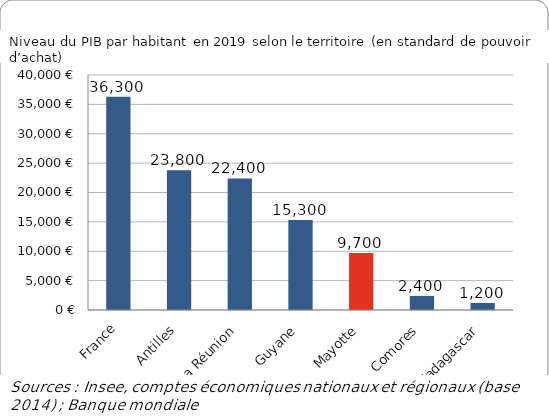
| Category | Series 0 |
|---|---|
| France | 36300 |
| Antilles | 23800 |
| La Réunion | 22400 |
| Guyane | 15300 |
| Mayotte | 9700 |
| Comores | 2400 |
| Madagascar | 1200 |